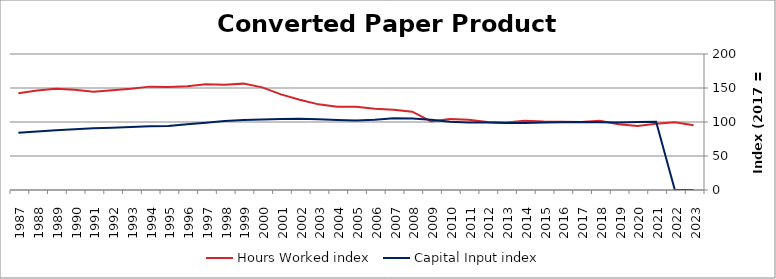
| Category | Hours Worked index | Capital Input index |
|---|---|---|
| 2023.0 | 95.122 | 0 |
| 2022.0 | 99.706 | 0 |
| 2021.0 | 97.364 | 100.299 |
| 2020.0 | 94.019 | 100.062 |
| 2019.0 | 96.727 | 99.283 |
| 2018.0 | 101.821 | 99.737 |
| 2017.0 | 100 | 100 |
| 2016.0 | 100.463 | 99.609 |
| 2015.0 | 100.625 | 99.282 |
| 2014.0 | 101.783 | 98.522 |
| 2013.0 | 99.44 | 98.682 |
| 2012.0 | 99.959 | 99.446 |
| 2011.0 | 103.435 | 99.27 |
| 2010.0 | 104.329 | 100.371 |
| 2009.0 | 100.912 | 103.242 |
| 2008.0 | 115.219 | 105.252 |
| 2007.0 | 118.078 | 105.534 |
| 2006.0 | 119.384 | 103.147 |
| 2005.0 | 122.382 | 102.177 |
| 2004.0 | 122.428 | 103.065 |
| 2003.0 | 125.936 | 104.21 |
| 2002.0 | 132.797 | 104.809 |
| 2001.0 | 140.628 | 104.433 |
| 2000.0 | 150.941 | 103.652 |
| 1999.0 | 156.427 | 102.948 |
| 1998.0 | 154.889 | 101.486 |
| 1997.0 | 155.534 | 98.86 |
| 1996.0 | 152.443 | 96.627 |
| 1995.0 | 151.551 | 93.997 |
| 1994.0 | 152.015 | 93.622 |
| 1993.0 | 148.883 | 92.797 |
| 1992.0 | 146.866 | 91.511 |
| 1991.0 | 144.335 | 90.656 |
| 1990.0 | 147.542 | 89.498 |
| 1989.0 | 148.729 | 87.797 |
| 1988.0 | 146.263 | 86.008 |
| 1987.0 | 142.341 | 84.196 |